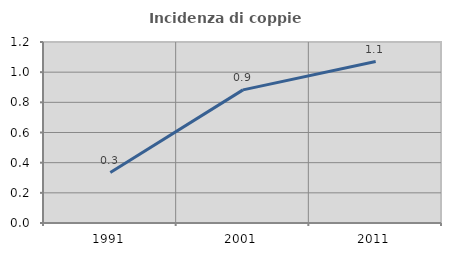
| Category | Incidenza di coppie miste |
|---|---|
| 1991.0 | 0.335 |
| 2001.0 | 0.882 |
| 2011.0 | 1.07 |